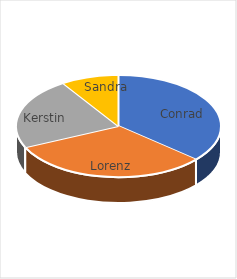
| Category | Umsatz April 2019 |
|---|---|
| Conrad | 800 |
| Lorenz | 700 |
| Kerstin | 500 |
| Sandra | 200 |